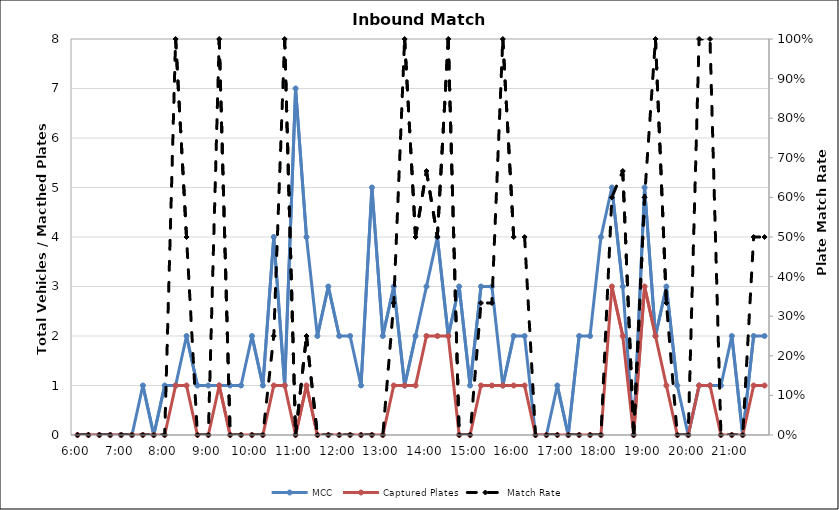
| Category | MCC | Captured Plates |
|---|---|---|
| 0.25 | 0 | 0 |
| 0.260416666666667 | 0 | 0 |
| 0.270833333333333 | 0 | 0 |
| 0.28125 | 0 | 0 |
| 0.291666666666667 | 0 | 0 |
| 0.302083333333333 | 0 | 0 |
| 0.3125 | 1 | 0 |
| 0.322916666666667 | 0 | 0 |
| 0.333333333333333 | 1 | 0 |
| 0.34375 | 1 | 1 |
| 0.354166666666667 | 2 | 1 |
| 0.364583333333333 | 1 | 0 |
| 0.375 | 1 | 0 |
| 0.385416666666667 | 1 | 1 |
| 0.395833333333333 | 1 | 0 |
| 0.40625 | 1 | 0 |
| 0.416666666666667 | 2 | 0 |
| 0.427083333333333 | 1 | 0 |
| 0.4375 | 4 | 1 |
| 0.447916666666667 | 1 | 1 |
| 0.458333333333333 | 7 | 0 |
| 0.46875 | 4 | 1 |
| 0.479166666666667 | 2 | 0 |
| 0.489583333333333 | 3 | 0 |
| 0.5 | 2 | 0 |
| 0.510416666666667 | 2 | 0 |
| 0.520833333333333 | 1 | 0 |
| 0.53125 | 5 | 0 |
| 0.541666666666667 | 2 | 0 |
| 0.552083333333333 | 3 | 1 |
| 0.5625 | 1 | 1 |
| 0.572916666666667 | 2 | 1 |
| 0.583333333333333 | 3 | 2 |
| 0.59375 | 4 | 2 |
| 0.604166666666667 | 2 | 2 |
| 0.614583333333333 | 3 | 0 |
| 0.625 | 1 | 0 |
| 0.635416666666667 | 3 | 1 |
| 0.645833333333333 | 3 | 1 |
| 0.65625 | 1 | 1 |
| 0.666666666666667 | 2 | 1 |
| 0.677083333333333 | 2 | 1 |
| 0.6875 | 0 | 0 |
| 0.697916666666667 | 0 | 0 |
| 0.708333333333333 | 1 | 0 |
| 0.71875 | 0 | 0 |
| 0.729166666666667 | 2 | 0 |
| 0.739583333333333 | 2 | 0 |
| 0.75 | 4 | 0 |
| 0.760416666666667 | 5 | 3 |
| 0.770833333333333 | 3 | 2 |
| 0.78125 | 0 | 0 |
| 0.791666666666667 | 5 | 3 |
| 0.802083333333333 | 2 | 2 |
| 0.8125 | 3 | 1 |
| 0.822916666666667 | 1 | 0 |
| 0.833333333333333 | 0 | 0 |
| 0.84375 | 1 | 1 |
| 0.854166666666667 | 1 | 1 |
| 0.864583333333333 | 1 | 0 |
| 0.875 | 2 | 0 |
| 0.885416666666667 | 0 | 0 |
| 0.895833333333333 | 2 | 1 |
| 0.90625 | 2 | 1 |